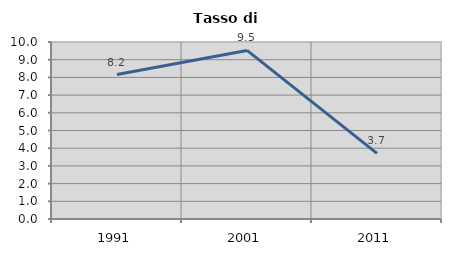
| Category | Tasso di disoccupazione   |
|---|---|
| 1991.0 | 8.163 |
| 2001.0 | 9.524 |
| 2011.0 | 3.704 |